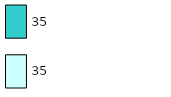
| Category | Series 0 | Series 1 |
|---|---|---|
| 0 | 35 | 35 |